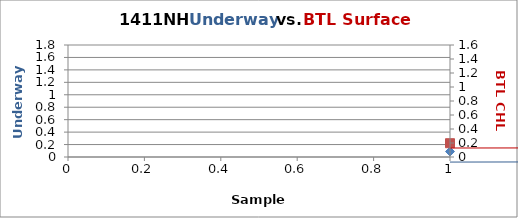
| Category |  FL |
|---|---|
| 0 | 0.088 |
| 1 | 0.078 |
| 2 | 0.073 |
| 3 | 0.068 |
| 4 | 0.07 |
| 5 | 0.086 |
| 6 | 0.076 |
| 7 | 0.082 |
| 8 | 0.086 |
| 9 | 0.08 |
| 10 | 0.076 |
| 11 | 0.074 |
| 12 | 0.073 |
| 13 | 0.214 |
| 14 | 0.076 |
| 15 | 0.074 |
| 16 | 0.074 |
| 17 | 0.066 |
| 18 | 0.069 |
| 19 | 0.065 |
| 20 | 0.061 |
| 21 | 0.072 |
| 22 | 0.062 |
| 23 | 0.068 |
| 24 | 0.062 |
| 25 | 0.06 |
| 26 | 0.072 |
| 27 | 0.066 |
| 28 | 0.073 |
| 29 | 0.073 |
| 30 | 0.079 |
| 31 | 0.072 |
| 32 | 0.078 |
| 33 | 0.067 |
| 34 | 0.069 |
| 35 | 0.078 |
| 36 | 0.074 |
| 37 | 0.082 |
| 38 | 0.08 |
| 39 | 0.091 |
| 40 | 0.2 |
| 41 | 0.127 |
| 42 | 0.099 |
| 43 | 0.079 |
| 44 | 0.076 |
| 45 | 0.063 |
| 46 | 0.083 |
| 47 | 0.182 |
| 48 | 0.264 |
| 49 | 0.182 |
| 50 | 0.402 |
| 51 | 1.608 |
| 52 | 0.845 |
| 53 | 0.945 |
| 54 | 0.345 |
| 55 | 0.183 |
| 56 | 0.392 |
| 57 | 0.171 |
| 58 | 0.202 |
| 59 | 0.141 |
| 60 | 0.254 |
| 61 | 0.319 |
| 62 | 0.371 |
| 63 | 0.327 |
| 64 | 0.451 |
| 65 | 0.721 |
| 66 | 0.83 |
| 67 | 0.787 |
| 68 | 0.524 |
| 69 | 0.474 |
| 70 | 0.182 |
| 71 | 0.586 |
| 72 | 0.715 |
| 73 | 1.579 |